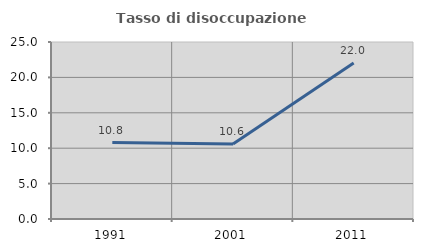
| Category | Tasso di disoccupazione giovanile  |
|---|---|
| 1991.0 | 10.789 |
| 2001.0 | 10.588 |
| 2011.0 | 22.018 |